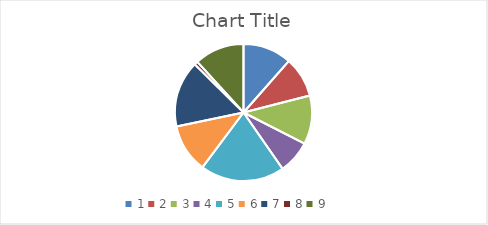
| Category | Series 0 |
|---|---|
| 0 | 0.161 |
| 1 | 0.133 |
| 2 | 0.161 |
| 3 | 0.11 |
| 4 | 0.278 |
| 5 | 0.161 |
| 6 | 0.22 |
| 7 | 0.012 |
| 8 | 0.165 |